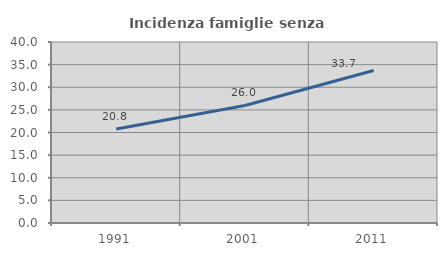
| Category | Incidenza famiglie senza nuclei |
|---|---|
| 1991.0 | 20.795 |
| 2001.0 | 25.973 |
| 2011.0 | 33.714 |